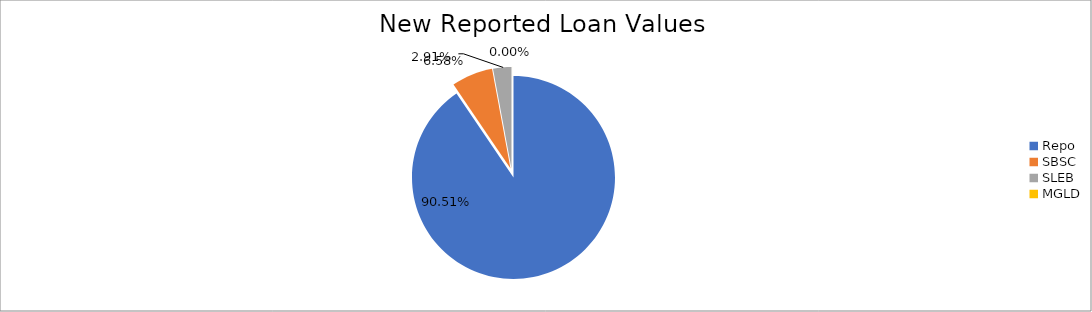
| Category | Series 0 |
|---|---|
| Repo | 13167704.92 |
| SBSC | 956724.92 |
| SLEB | 423605.625 |
| MGLD | 663.578 |